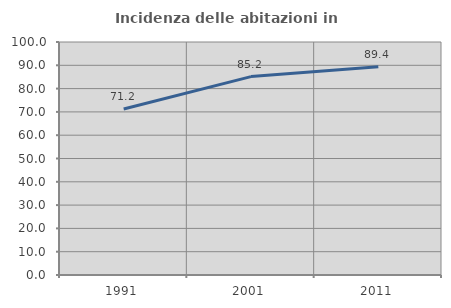
| Category | Incidenza delle abitazioni in proprietà  |
|---|---|
| 1991.0 | 71.212 |
| 2001.0 | 85.156 |
| 2011.0 | 89.357 |